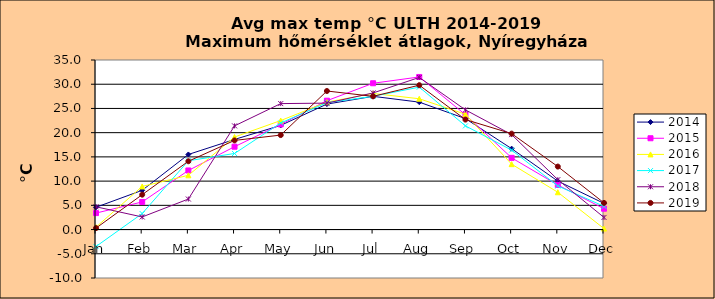
| Category | 2014 | 2015 | 2016 | 2017 | 2018 | 2019 |
|---|---|---|---|---|---|---|
| Jan | 4.6 | 3.4 | 0.5 | -3.5 | 4.7 | 0.3 |
| Feb | 8.1 | 5.7 | 8.9 | 3.3 | 2.6 | 7.2 |
| Mar | 15.5 | 12.2 | 11.2 | 14.2 | 6.3 | 14.1 |
| Apr | 18.6 | 17.1 | 19.1 | 15.7 | 21.4 | 18.4 |
| May | 21.5 | 21.7 | 22.5 | 22 | 26 | 19.5 |
| Jun | 25.9 | 26.6 | 26.3 | 26.2 | 26.1 | 28.6 |
| Jul | 27.5 | 30.2 | 28.1 | 27.5 | 28.2 | 27.5 |
| Aug | 26.3 | 31.5 | 27 | 29.4 | 31.4 | 29.8 |
| Sep | 22.9 | 23.7 | 23.8 | 21.4 | 24.7 | 22.7 |
| Oct | 16.7 | 14.8 | 13.5 | 16.4 | 19.6 | 19.8 |
| Nov | 10 | 9.2 | 7.7 | 9 | 10.3 | 13 |
| Dec | 5.4 | 4.3 | 0.2 | 4.8 | 2.5 | 5.5 |